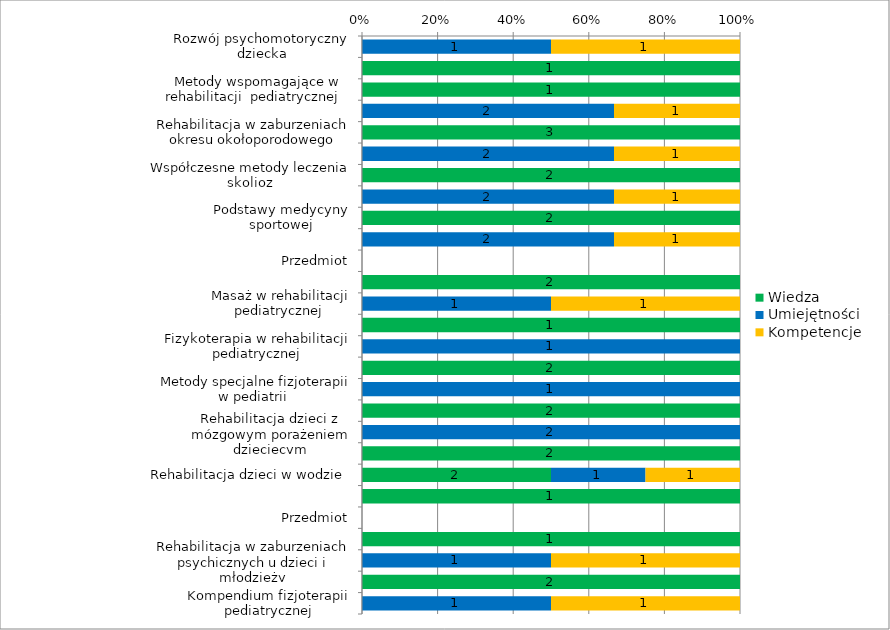
| Category | Wiedza | Umiejętności | Kompetencje |
|---|---|---|---|
| Rozwój psychomotoryczny dziecka | 0 | 1 | 1 |
| Diagnostyka obrazowa w pediatrii  | 1 | 0 | 0 |
| Metody wspomagające w rehabilitacji  pediatrycznej   | 1 | 0 | 0 |
| Metody wspomagające w rehabilitacji  pediatrycznej   | 0 | 2 | 1 |
| Rehabilitacja w zaburzeniach okresu okołoporodowego | 3 | 0 | 0 |
| Rehabilitacja w zaburzeniach okresu okołoporodowego | 0 | 2 | 1 |
| Współczesne metody leczenia skolioz | 2 | 0 | 0 |
| Współczesne metody leczenia skolioz | 0 | 2 | 1 |
| Podstawy medycyny sportowej | 2 | 0 | 0 |
| Podstawy medycyny sportowej | 0 | 2 | 1 |
| Przedmiot | 0 | 0 | 0 |
| Masaż w rehabilitacji pediatrycznej  | 2 | 0 | 0 |
| Masaż w rehabilitacji pediatrycznej  | 0 | 1 | 1 |
| Fizykoterapia w rehabilitacji pediatrycznej | 1 | 0 | 0 |
| Fizykoterapia w rehabilitacji pediatrycznej | 0 | 1 | 0 |
| Metody specjalne fizjoterapii w pediatrii  | 2 | 0 | 0 |
| Metody specjalne fizjoterapii w pediatrii  | 0 | 1 | 0 |
| Rehabilitacja dzieci z mózgowym porażeniem dziecięcym | 2 | 0 | 0 |
| Rehabilitacja dzieci z mózgowym porażeniem dziecięcym | 0 | 2 | 0 |
| Dziecko niepełnosprawne w rodzinie | 2 | 0 | 0 |
| Rehabilitacja dzieci w wodzie  | 2 | 1 | 1 |
| Rehabilitacja dzieci z chorobami narządów wewnętrznych | 1 | 0 | 0 |
| Przedmiot | 0 | 0 | 0 |
| Rehabilitacja w zaburzeniach psychicznych u dzieci i młodzieży | 1 | 0 | 0 |
| Rehabilitacja w zaburzeniach psychicznych u dzieci i młodzieży | 0 | 1 | 1 |
| Kompendium fizjoterapii pediatrycznej | 2 | 0 | 0 |
| Kompendium fizjoterapii pediatrycznej | 0 | 1 | 1 |